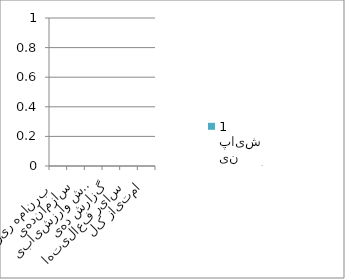
| Category | میانگین پایش1 | میانگین پایش2 |
|---|---|---|
| برنامه ریزی  | 0 | 0 |
| سازماندهی | 0 | 0 |
| پایش وارزشیابی | 0 | 0 |
| گزارش دهی | 0 | 0 |
| سایر فعالیتها | 0 | 0 |
| امتیاز کل | 0 | 0 |